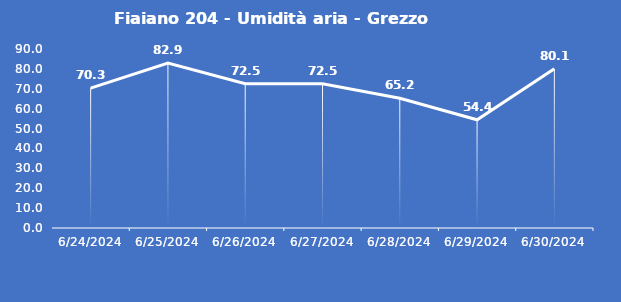
| Category | Fiaiano 204 - Umidità aria - Grezzo (%) |
|---|---|
| 6/24/24 | 70.3 |
| 6/25/24 | 82.9 |
| 6/26/24 | 72.5 |
| 6/27/24 | 72.5 |
| 6/28/24 | 65.2 |
| 6/29/24 | 54.4 |
| 6/30/24 | 80.1 |